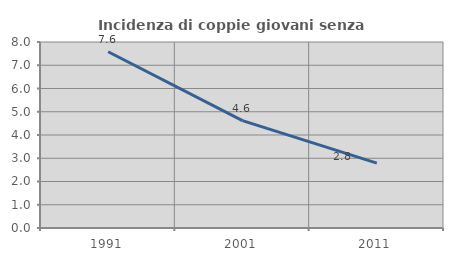
| Category | Incidenza di coppie giovani senza figli |
|---|---|
| 1991.0 | 7.579 |
| 2001.0 | 4.619 |
| 2011.0 | 2.792 |